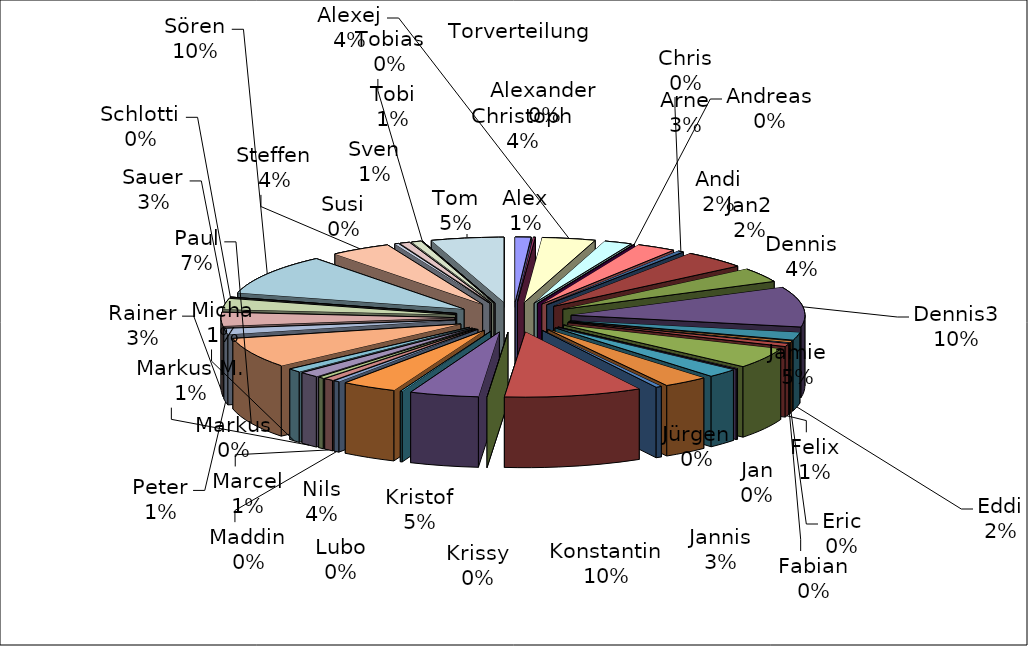
| Category | Series 0 |
|---|---|
| Alex | 8 |
| Alexander | 1 |
| Alexej | 27 |
| Andi | 14 |
| Andreas | 0 |
| Arne | 20 |
| Chris | 3 |
| Christoph | 33 |
| Dennis | 26 |
| Dennis3 | 73 |
| Eddi | 14 |
| Eric | 3 |
| Fabian | 1 |
| Felix | 5 |
| Jamie | 37 |
| Jan | 1 |
| Jan2 | 16 |
| Jannis | 23 |
| Jürgen | 3 |
| Konstantin | 70 |
| Krissy | 0 |
| Kristof | 35 |
| Lubo | 1 |
| Nils | 28 |
| Maddin | 3 |
| Marcel | 5 |
| Markus | 3 |
| Markus M. | 10 |
| Micha | 7 |
| Paul | 55 |
| Peter | 11 |
| Rainer | 25 |
| Sauer | 20 |
| Schlotti | 0 |
| Sören | 74 |
| Steffen | 31 |
| Susi | 2 |
| Sven | 5 |
| Tobi | 5 |
| Tobias | 0 |
| Tom | 37 |